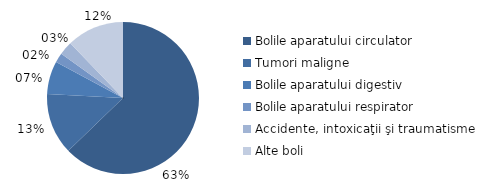
| Category | Femei |
|---|---|
| Bolile aparatului circulator | 62.771 |
| Tumori maligne | 13.075 |
| Bolile aparatului digestiv | 7.013 |
| Bolile aparatului respirator | 2.048 |
| Accidente, intoxicaţii şi traumatisme | 2.9 |
| Alte boli | 12.2 |